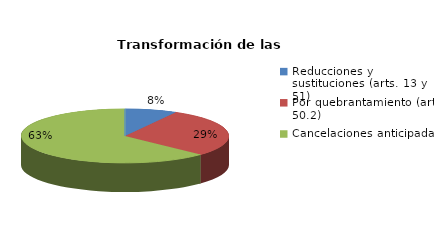
| Category | Series 0 |
|---|---|
| Reducciones y sustituciones (arts. 13 y 51) | 5 |
| Por quebrantamiento (art. 50.2) | 18 |
| Cancelaciones anticipadas | 39 |
| Traslado a Centros Penitenciarios | 0 |
| Conversión internamientos en cerrados (art. 51.2) | 0 |